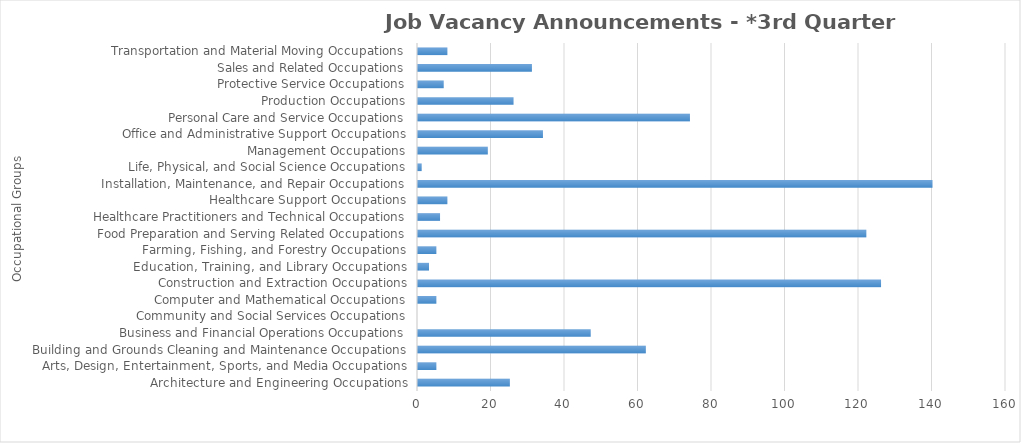
| Category | Total JVAs |
|---|---|
| Architecture and Engineering Occupations | 25 |
| Arts, Design, Entertainment, Sports, and Media Occupations | 5 |
| Building and Grounds Cleaning and Maintenance Occupations | 62 |
| Business and Financial Operations Occupations | 47 |
| Community and Social Services Occupations | 0 |
| Computer and Mathematical Occupations | 5 |
| Construction and Extraction Occupations | 126 |
| Education, Training, and Library Occupations | 3 |
| Farming, Fishing, and Forestry Occupations | 5 |
| Food Preparation and Serving Related Occupations | 122 |
| Healthcare Practitioners and Technical Occupations | 6 |
| Healthcare Support Occupations | 8 |
| Installation, Maintenance, and Repair Occupations | 140 |
| Life, Physical, and Social Science Occupations | 1 |
| Management Occupations | 19 |
| Office and Administrative Support Occupations | 34 |
| Personal Care and Service Occupations | 74 |
| Production Occupations | 26 |
| Protective Service Occupations | 7 |
| Sales and Related Occupations | 31 |
| Transportation and Material Moving Occupations | 8 |